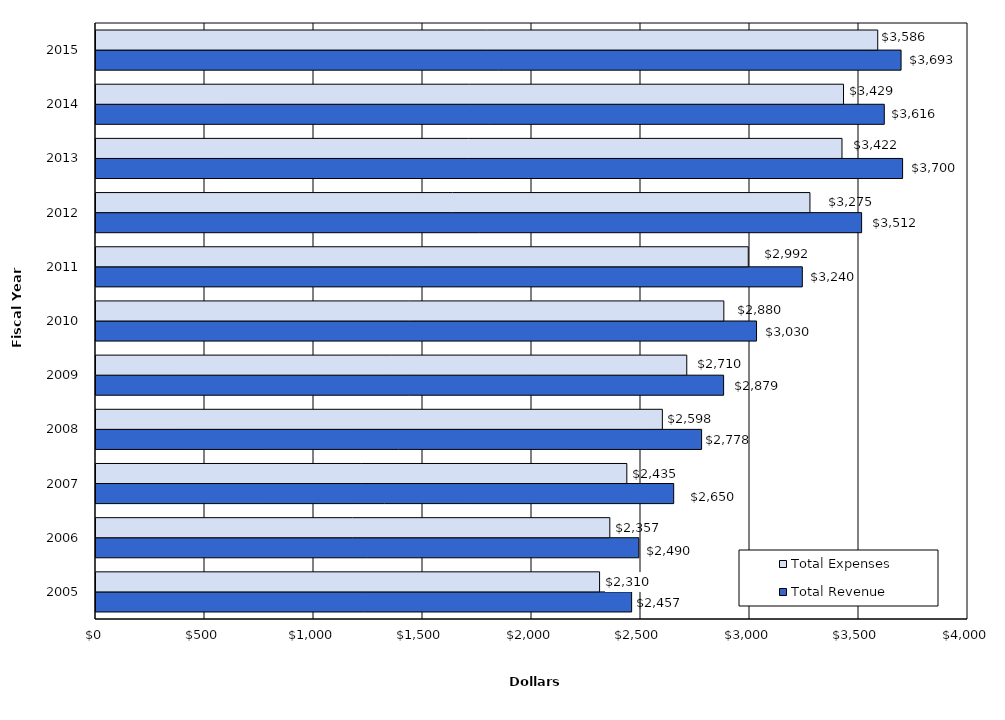
| Category | Total Revenue | Total Expenses |
|---|---|---|
| 2005.0 | 2457 | 2310 |
| 2006.0 | 2490 | 2357 |
| 2007.0 | 2650 | 2435 |
| 2008.0 | 2778 | 2598 |
| 2009.0 | 2879 | 2710 |
| 2010.0 | 3030 | 2880 |
| 2011.0 | 3240 | 2992 |
| 2012.0 | 3512 | 3275 |
| 2013.0 | 3700 | 3422 |
| 2014.0 | 3616 | 3429 |
| 2015.0 | 3693 | 3586 |